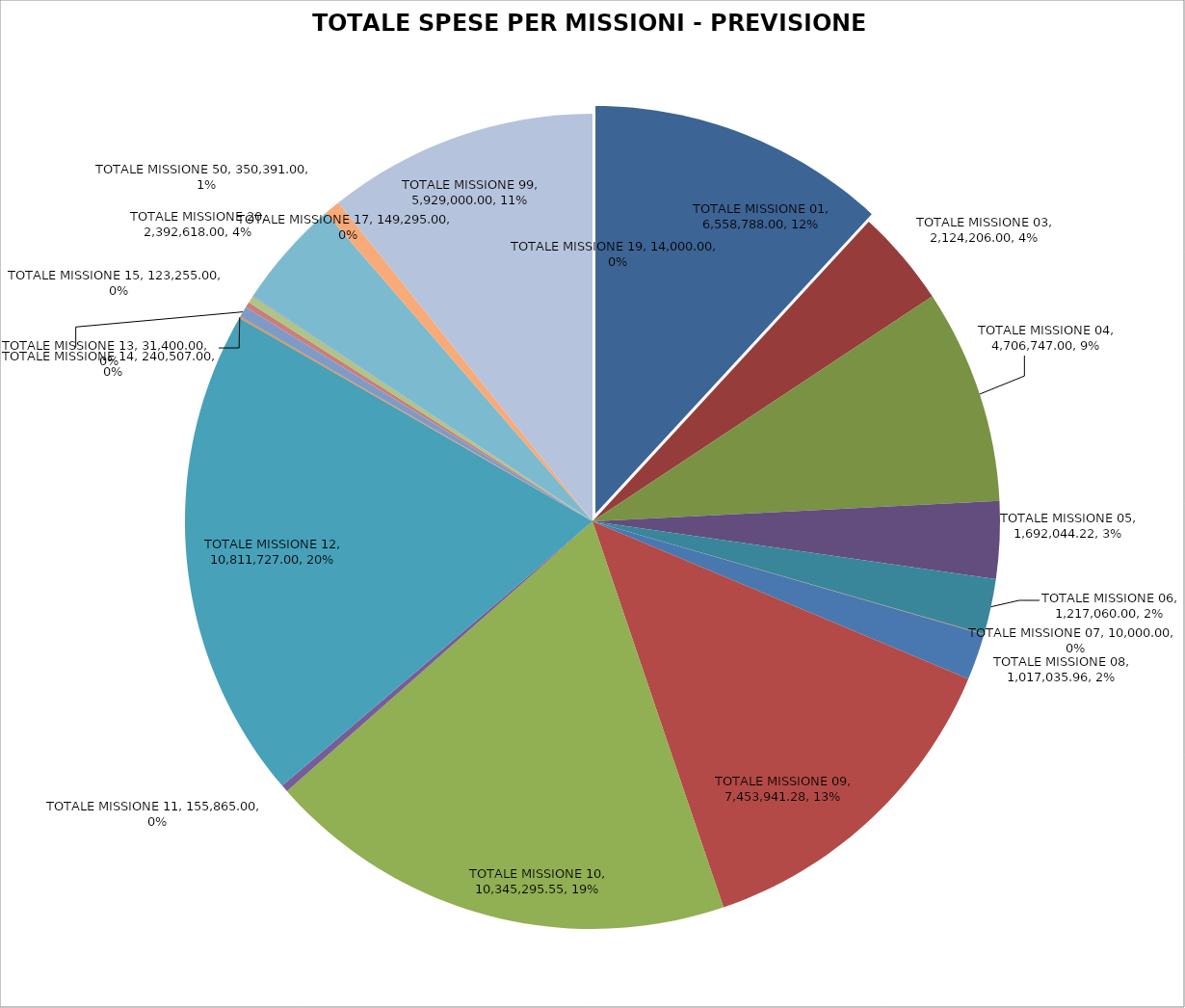
| Category | Series 0 |
|---|---|
| TOTALE MISSIONE 01 | 6558788 |
| TOTALE MISSIONE 03 | 2124206 |
| TOTALE MISSIONE 04 | 4706747 |
| TOTALE MISSIONE 05 | 1692044.22 |
| TOTALE MISSIONE 06 | 1217060 |
| TOTALE MISSIONE 07 | 10000 |
| TOTALE MISSIONE 08 | 1017035.96 |
| TOTALE MISSIONE 09 | 7453941.28 |
| TOTALE MISSIONE 10 | 10345295.55 |
| TOTALE MISSIONE 11 | 155865 |
| TOTALE MISSIONE 12 | 10811727 |
| TOTALE MISSIONE 13 | 31400 |
| TOTALE MISSIONE 14 | 240507 |
| TOTALE MISSIONE 15 | 123255 |
| TOTALE MISSIONE 17 | 149295 |
| TOTALE MISSIONE 19 | 14000 |
| TOTALE MISSIONE 20 | 2392618 |
| TOTALE MISSIONE 50 | 350391 |
| TOTALE MISSIONE 99 | 5929000 |